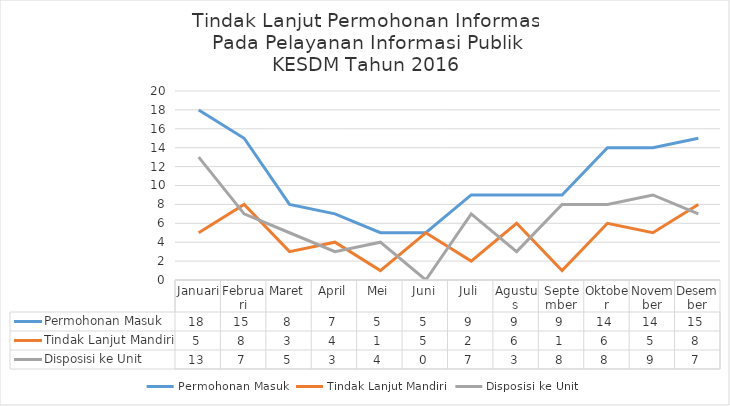
| Category | Permohonan Masuk | Tindak Lanjut Mandiri | Disposisi ke Unit |
|---|---|---|---|
| Januari | 18 | 5 | 13 |
| Februari | 15 | 8 | 7 |
| Maret | 8 | 3 | 5 |
| April | 7 | 4 | 3 |
| Mei | 5 | 1 | 4 |
| Juni | 5 | 5 | 0 |
| Juli | 9 | 2 | 7 |
| Agustus | 9 | 6 | 3 |
| September | 9 | 1 | 8 |
| Oktober | 14 | 6 | 8 |
| November | 14 | 5 | 9 |
| Desember | 15 | 8 | 7 |